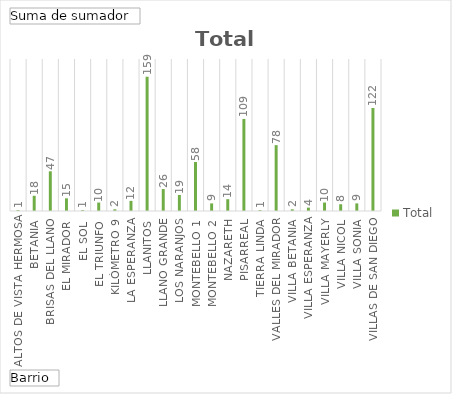
| Category | Total |
|---|---|
| Altos de Vista Hermosa | 1 |
| Betania | 18 |
| Brisas del Llano | 47 |
| El Mirador | 15 |
| El Sol | 1 |
| El Triunfo | 10 |
| Kilómetro 9 | 2 |
| La Esperanza | 12 |
| Llanitos | 159 |
| Llano Grande | 26 |
| Los Naranjos | 19 |
| Montebello 1 | 58 |
| Montebello 2 | 9 |
| Nazareth | 14 |
| Pisarreal | 109 |
| Tierra Linda | 1 |
| Valles del Mirador | 78 |
| Villa Betania | 2 |
| Villa Esperanza | 4 |
| Villa Mayerly | 10 |
| Villa Nicol | 8 |
| Villa Sonia | 9 |
| Villas de San Diego | 122 |